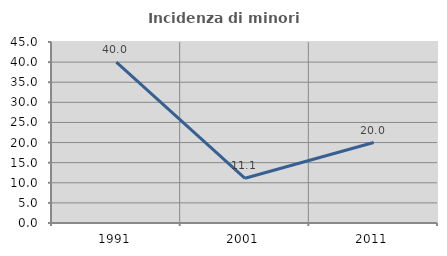
| Category | Incidenza di minori stranieri |
|---|---|
| 1991.0 | 40 |
| 2001.0 | 11.111 |
| 2011.0 | 20 |